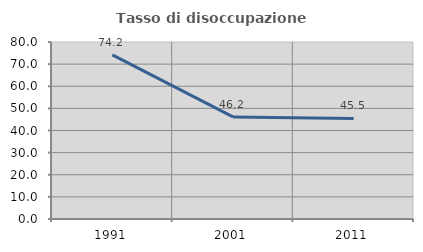
| Category | Tasso di disoccupazione giovanile  |
|---|---|
| 1991.0 | 74.194 |
| 2001.0 | 46.154 |
| 2011.0 | 45.455 |